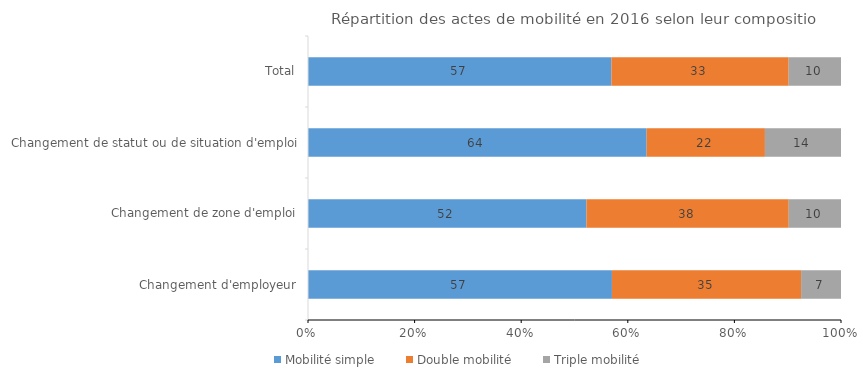
| Category | Mobilité simple | Double mobilité | Triple mobilité |
|---|---|---|---|
| Changement d'employeur | 57.027 | 35.485 | 7.488 |
| Changement de zone d'emploi | 52.248 | 37.95 | 9.802 |
| Changement de statut ou de situation d'emploi | 63.533 | 22.194 | 14.273 |
| Total | 56.923 | 33.261 | 9.816 |